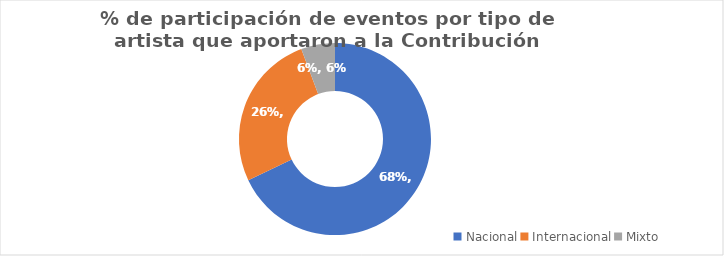
| Category | % año 2022 |
|---|---|
| Nacional | 0.679 |
| Internacional | 0.264 |
| Mixto | 0.057 |